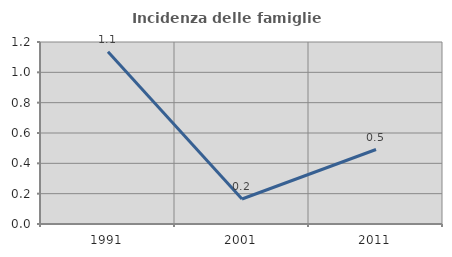
| Category | Incidenza delle famiglie numerose |
|---|---|
| 1991.0 | 1.136 |
| 2001.0 | 0.165 |
| 2011.0 | 0.491 |